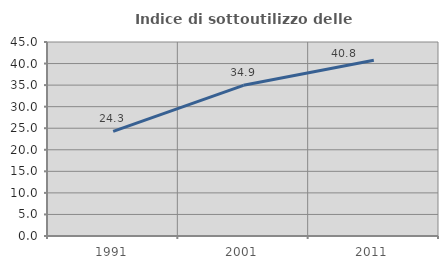
| Category | Indice di sottoutilizzo delle abitazioni  |
|---|---|
| 1991.0 | 24.255 |
| 2001.0 | 34.949 |
| 2011.0 | 40.758 |